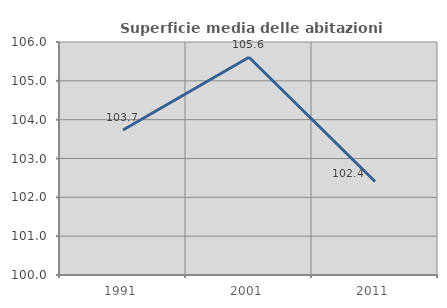
| Category | Superficie media delle abitazioni occupate |
|---|---|
| 1991.0 | 103.733 |
| 2001.0 | 105.606 |
| 2011.0 | 102.408 |